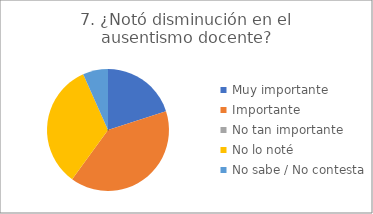
| Category | 7. ¿Notó disminución en el ausentismo docente? | 2. ¿Notó disminución de las llegadas tarde de los niños? |
|---|---|---|
| Muy importante  | 0.2 | 0 |
| Importante  | 0.4 | 0.533 |
| No tan importante  | 0 | 0.267 |
| No lo noté  | 0.333 | 0.067 |
| No sabe / No contesta | 0.067 | 0.133 |